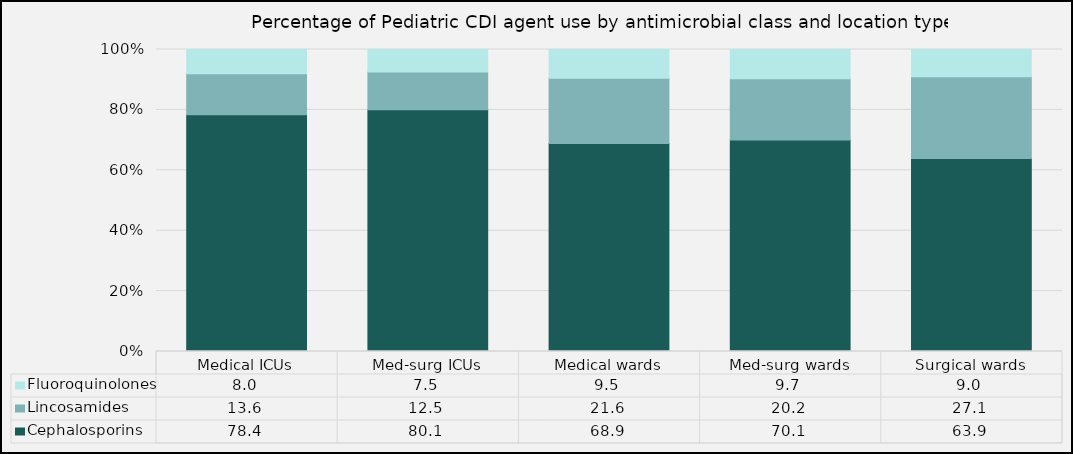
| Category | Cephalosporins | Lincosamides | Fluoroquinolones |
|---|---|---|---|
| Medical ICUs | 78.36 | 13.61 | 8.03 |
| Med-surg ICUs | 80.07 | 12.45 | 7.48 |
| Medical wards | 68.89 | 21.58 | 9.53 |
| Med-surg wards | 70.05 | 20.23 | 9.72 |
| Surgical wards | 63.87 | 27.11 | 9.02 |